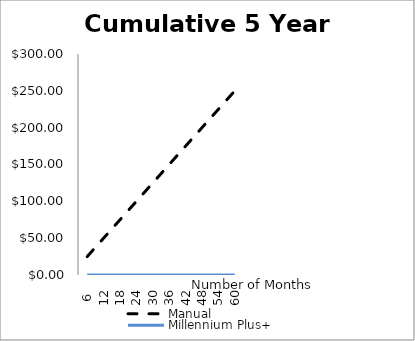
| Category | Manual | Millennium Plus+ |
|---|---|---|
| 6  | 25 | 0 |
| 12 | 50 | 0 |
| 18 | 75 | 0 |
| 24 | 100 | 0 |
| 30 | 125 | 0 |
| 36 | 150 | 0 |
| 42 | 175 | 0 |
| 48 | 200 | 0 |
| 54 | 225 | 0 |
| 60 | 250 | 0 |